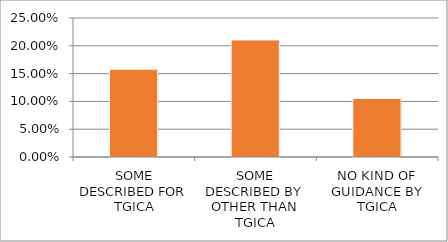
| Category | Series 0 |
|---|---|
| SOME DESCRIBED FOR TGICA | 0.158 |
| SOME DESCRIBED BY OTHER THAN TGICA | 0.211 |
| NO KIND OF GUIDANCE BY TGICA | 0.105 |